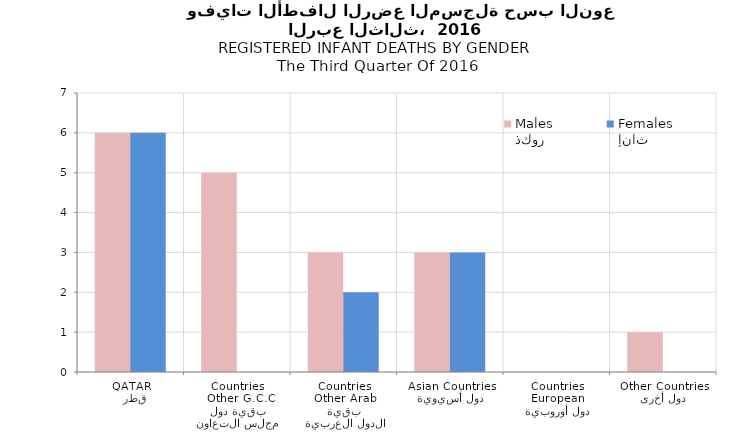
| Category | ذكور
Males | إناث
Females |
|---|---|---|
|   قطر
QATAR | 6 | 6 |
| بقية دول مجلس التعاون
 Other G.C.C Countries | 5 | 0 |
| بقية الدول العربية
Other Arab Countries | 3 | 2 |
| دول أسيوية
Asian Countries | 3 | 3 |
| دول أوروبية
European Countries | 0 | 0 |
| دول أخرى
Other Countries | 1 | 0 |